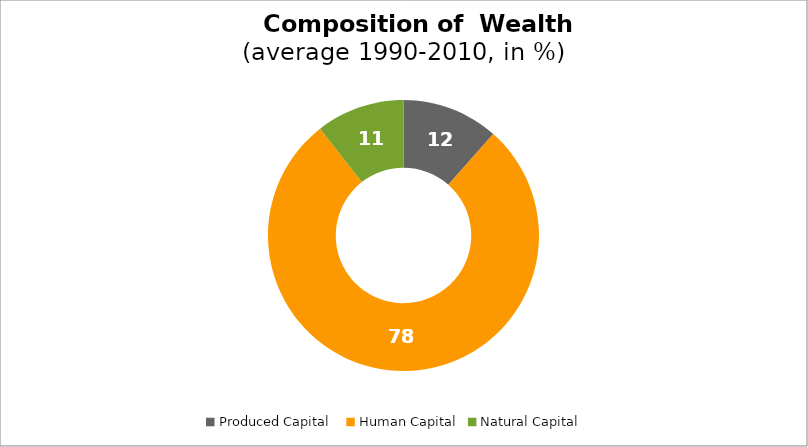
| Category | Series 0 |
|---|---|
| Produced Capital  | 11.52 |
| Human Capital | 77.937 |
| Natural Capital | 10.543 |